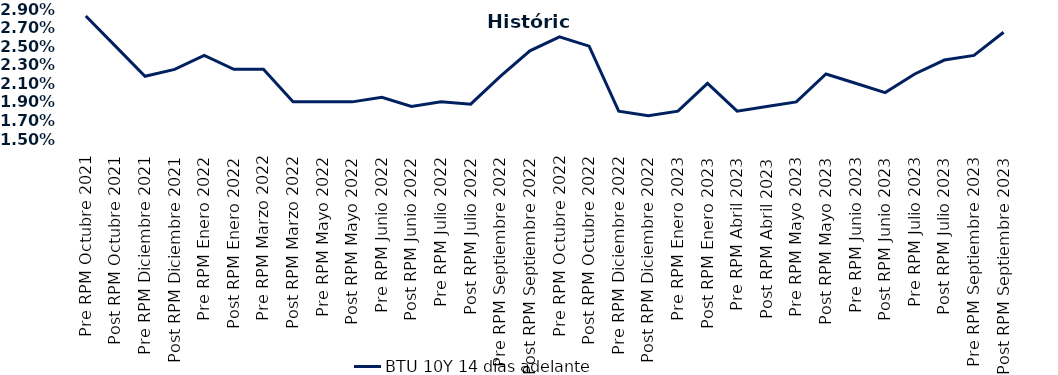
| Category | BTU 10Y 14 días adelante |
|---|---|
| Pre RPM Octubre 2021 | 0.028 |
| Post RPM Octubre 2021 | 0.025 |
| Pre RPM Diciembre 2021 | 0.022 |
| Post RPM Diciembre 2021 | 0.022 |
| Pre RPM Enero 2022 | 0.024 |
| Post RPM Enero 2022 | 0.022 |
| Pre RPM Marzo 2022 | 0.022 |
| Post RPM Marzo 2022 | 0.019 |
| Pre RPM Mayo 2022 | 0.019 |
| Post RPM Mayo 2022 | 0.019 |
| Pre RPM Junio 2022 | 0.02 |
| Post RPM Junio 2022 | 0.018 |
| Pre RPM Julio 2022 | 0.019 |
| Post RPM Julio 2022 | 0.019 |
| Pre RPM Septiembre 2022 | 0.022 |
| Post RPM Septiembre 2022 | 0.024 |
| Pre RPM Octubre 2022 | 0.026 |
| Post RPM Octubre 2022 | 0.025 |
| Pre RPM Diciembre 2022 | 0.018 |
| Post RPM Diciembre 2022 | 0.018 |
| Pre RPM Enero 2023 | 0.018 |
| Post RPM Enero 2023 | 0.021 |
| Pre RPM Abril 2023 | 0.018 |
| Post RPM Abril 2023 | 0.018 |
| Pre RPM Mayo 2023 | 0.019 |
| Post RPM Mayo 2023 | 0.022 |
| Pre RPM Junio 2023 | 0.021 |
| Post RPM Junio 2023 | 0.02 |
| Pre RPM Julio 2023 | 0.022 |
| Post RPM Julio 2023 | 0.024 |
| Pre RPM Septiembre 2023 | 0.024 |
| Post RPM Septiembre 2023 | 0.026 |